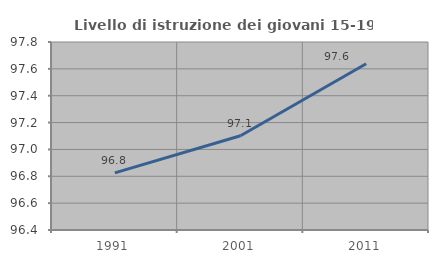
| Category | Livello di istruzione dei giovani 15-19 anni |
|---|---|
| 1991.0 | 96.825 |
| 2001.0 | 97.101 |
| 2011.0 | 97.638 |